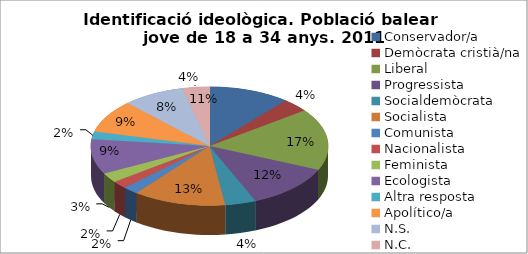
| Category | Series 0 |
|---|---|
| Conservador/a | 0.111 |
| Demòcrata cristià/na | 0.037 |
| Liberal | 0.168 |
| Progressista | 0.121 |
| Socialdemòcrata | 0.042 |
| Socialista | 0.126 |
| Comunista | 0.021 |
| Nacionalista | 0.021 |
| Feminista | 0.026 |
| Ecologista | 0.095 |
| Altra resposta | 0.021 |
| Apolítico/a | 0.089 |
| N.S. | 0.084 |
| N.C. | 0.037 |